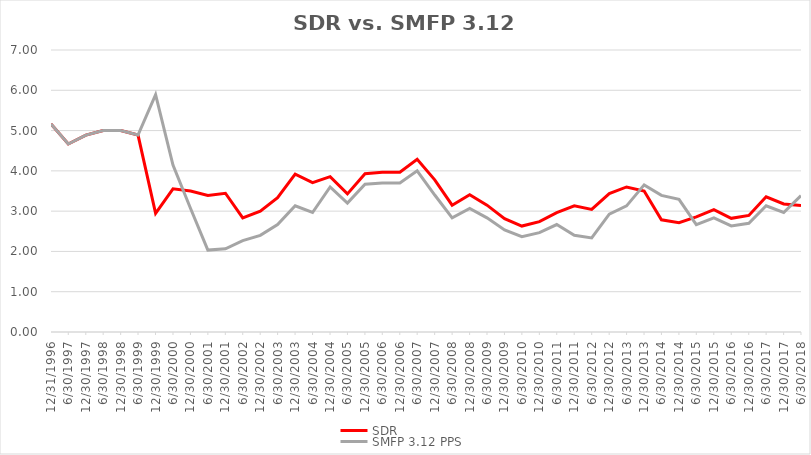
| Category | SDR | SMFP 3.12 PPS |
|---|---|---|
| 12/31/96 | 5.167 | 5.167 |
| 6/30/97 | 4.667 | 4.667 |
| 12/31/97 | 4.889 | 4.889 |
| 6/30/98 | 5 | 5 |
| 12/31/98 | 5 | 5 |
| 6/30/99 | 4.889 | 4.889 |
| 12/31/99 | 2.944 | 5.889 |
| 6/30/00 | 3.556 | 4.142 |
| 12/31/00 | 3.5 | 3.065 |
| 6/30/01 | 3.389 | 2.033 |
| 12/31/01 | 3.444 | 2.067 |
| 6/30/02 | 2.833 | 2.267 |
| 12/31/02 | 3 | 2.4 |
| 6/30/03 | 3.333 | 2.667 |
| 12/31/03 | 3.917 | 3.133 |
| 6/30/04 | 3.708 | 2.967 |
| 12/31/04 | 3.857 | 3.6 |
| 6/30/05 | 3.429 | 3.2 |
| 12/31/05 | 3.929 | 3.667 |
| 6/30/06 | 3.964 | 3.7 |
| 12/31/06 | 3.964 | 3.7 |
| 6/30/07 | 4.286 | 4 |
| 12/31/07 | 3.778 | 3.4 |
| 6/30/08 | 3.148 | 2.833 |
| 12/31/08 | 3.407 | 3.067 |
| 6/30/09 | 3.148 | 2.833 |
| 12/31/09 | 2.815 | 2.533 |
| 6/30/10 | 2.63 | 2.367 |
| 12/31/10 | 2.741 | 2.467 |
| 6/30/11 | 2.963 | 2.667 |
| 12/31/11 | 3.13 | 2.4 |
| 6/30/12 | 3.043 | 2.333 |
| 12/31/12 | 3.435 | 2.926 |
| 6/30/13 | 3.6 | 3.13 |
| 12/31/13 | 3.5 | 3.652 |
| 6/30/14 | 2.786 | 3.391 |
| 12/31/14 | 2.714 | 3.293 |
| 6/30/15 | 2.857 | 2.667 |
| 12/31/15 | 3.036 | 2.833 |
| 6/30/16 | 2.821 | 2.633 |
| 12/31/16 | 2.893 | 2.7 |
| 6/30/17 | 3.357 | 3.133 |
| 12/31/17 | 3.179 | 2.967 |
| 6/30/18 | 3.143 | 3.385 |